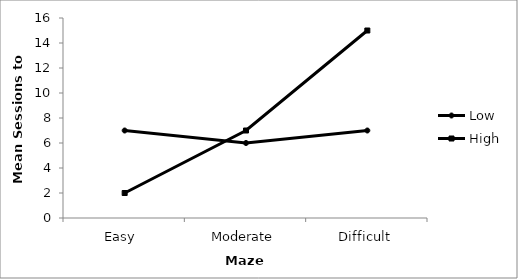
| Category | Low | High |
|---|---|---|
| Easy  | 7 | 2 |
| Moderate | 6 | 7 |
| Difficult | 7 | 15 |